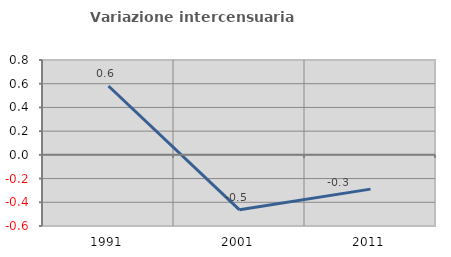
| Category | Variazione intercensuaria annua |
|---|---|
| 1991.0 | 0.581 |
| 2001.0 | -0.463 |
| 2011.0 | -0.289 |